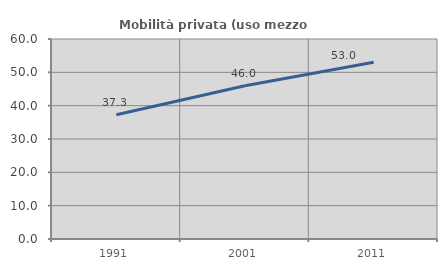
| Category | Mobilità privata (uso mezzo privato) |
|---|---|
| 1991.0 | 37.275 |
| 2001.0 | 45.991 |
| 2011.0 | 53.01 |